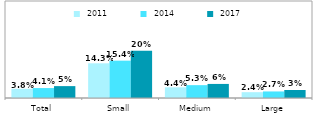
| Category |  2011 |  2014 |  2017 |
|---|---|---|---|
| Total | 0.038 | 0.041 | 0.049 |
| Small | 0.143 | 0.154 | 0.195 |
| Medium | 0.044 | 0.053 | 0.058 |
| Large | 0.024 | 0.027 | 0.033 |